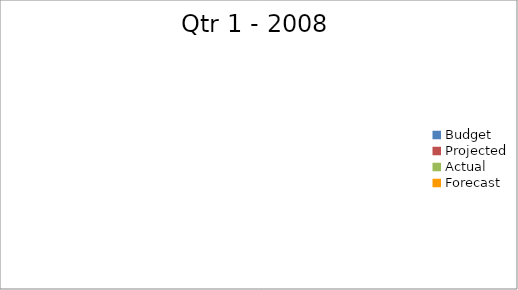
| Category | Series 0 |
|---|---|
| Budget | 1680 |
| Projected | 3140 |
| Actual | 3280 |
| Forecast | 1160 |